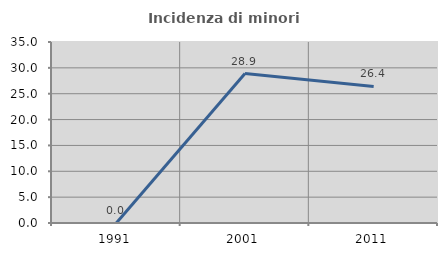
| Category | Incidenza di minori stranieri |
|---|---|
| 1991.0 | 0 |
| 2001.0 | 28.889 |
| 2011.0 | 26.4 |